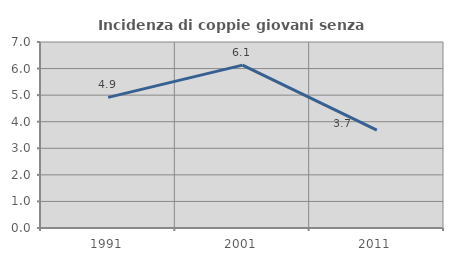
| Category | Incidenza di coppie giovani senza figli |
|---|---|
| 1991.0 | 4.917 |
| 2001.0 | 6.131 |
| 2011.0 | 3.685 |